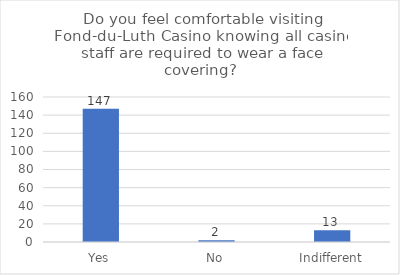
| Category | Series 0 |
|---|---|
| Yes | 147 |
| No | 2 |
| Indifferent | 13 |